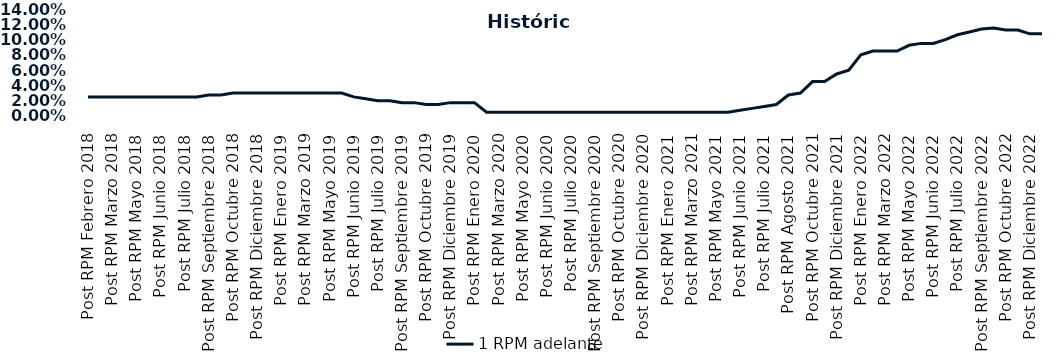
| Category | 1 RPM adelante |
|---|---|
| Post RPM Febrero 2018 | 0.025 |
| Pre RPM Marzo 2018 | 0.025 |
| Post RPM Marzo 2018 | 0.025 |
| Pre RPM Mayo 2018 | 0.025 |
| Post RPM Mayo 2018 | 0.025 |
| Pre RPM Junio 2018 | 0.025 |
| Post RPM Junio 2018 | 0.025 |
| Pre RPM Julio 2018 | 0.025 |
| Post RPM Julio 2018 | 0.025 |
| Pre RPM Septiembre 2018 | 0.025 |
| Post RPM Septiembre 2018 | 0.028 |
| Pre RPM Octubre 2018 | 0.028 |
| Post RPM Octubre 2018 | 0.03 |
| Pre RPM Diciembre 2018 | 0.03 |
| Post RPM Diciembre 2018 | 0.03 |
| Pre RPM Enero 2019 | 0.03 |
| Post RPM Enero 2019 | 0.03 |
| Pre RPM Marzo 2019 | 0.03 |
| Post RPM Marzo 2019 | 0.03 |
| Pre RPM Mayo 2019 | 0.03 |
| Post RPM Mayo 2019 | 0.03 |
| Pre RPM Junio 2019 | 0.03 |
| Post RPM Junio 2019 | 0.025 |
| Pre RPM Julio 2019 | 0.022 |
| Post RPM Julio 2019 | 0.02 |
| Pre RPM Septiembre 2019 | 0.02 |
| Post RPM Septiembre 2019 | 0.018 |
| Pre RPM Octubre 2019 | 0.018 |
| Post RPM Octubre 2019 | 0.015 |
| Pre RPM Diciembre 2019 | 0.015 |
| Post RPM Diciembre 2019 | 0.018 |
| Pre RPM Enero 2020 | 0.018 |
| Post RPM Enero 2020 | 0.018 |
| Pre RPM Marzo 2020 | 0.005 |
| Post RPM Marzo 2020 | 0.005 |
| Pre RPM Mayo 2020 | 0.005 |
| Post RPM Mayo 2020 | 0.005 |
| Pre RPM Junio 2020 | 0.005 |
| Post RPM Junio 2020 | 0.005 |
| Pre RPM Julio 2020 | 0.005 |
| Post RPM Julio 2020 | 0.005 |
| Pre RPM Septiembre 2020 | 0.005 |
| Post RPM Septiembre 2020 | 0.005 |
| Pre RPM Octubre 2020 | 0.005 |
| Post RPM Octubre 2020 | 0.005 |
| Pre RPM Diciembre 2020 | 0.005 |
| Post RPM Diciembre 2020 | 0.005 |
| Pre RPM Enero 2021 | 0.005 |
| Post RPM Enero 2021 | 0.005 |
| Pre RPM Marzo 2021 | 0.005 |
| Post RPM Marzo 2021 | 0.005 |
| Pre RPM Mayo 2021 | 0.005 |
| Post RPM Mayo 2021 | 0.005 |
| Pre RPM Junio 2021 | 0.005 |
| Post RPM Junio 2021 | 0.008 |
| Pre RPM Julio 2021 | 0.01 |
| Post RPM Julio 2021 | 0.012 |
| Pre RPM Agosto 2021 | 0.015 |
| Post RPM Agosto 2021 | 0.028 |
| Pre RPM Octubre 2021 | 0.03 |
| Post RPM Octubre 2021 | 0.045 |
| Pre RPM Diciembre 2021 | 0.045 |
| Post RPM Diciembre 2021 | 0.055 |
| Pre RPM Enero 2022 | 0.06 |
| Post RPM Enero 2022 | 0.08 |
| Pre RPM Marzo 2022 | 0.085 |
| Post RPM Marzo 2022 | 0.085 |
| Pre RPM Mayo 2022 | 0.085 |
| Post RPM Mayo 2022 | 0.092 |
| Pre RPM Junio 2022 | 0.095 |
| Post RPM Junio 2022 | 0.095 |
| Pre RPM Julio 2022 | 0.1 |
| Post RPM Julio 2022 | 0.106 |
| Pre RPM Septiembre 2022 | 0.11 |
| Post RPM Septiembre 2022 | 0.114 |
| Pre RPM Octubre 2022 | 0.115 |
| Post RPM Octubre 2022 | 0.112 |
| Pre RPM Diciembre 2022 | 0.112 |
| Post RPM Diciembre 2022 | 0.108 |
| Pre RPM Enero 2023 | 0.108 |